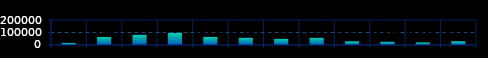
| Category | Series 0 |
|---|---|
| Mar 15 | 17227 |
| Jun 15 | 64814 |
| Sep 15 | 82965 |
| Dec 15 | 97506 |
| Mar 16 | 65379 |
| Jun 16 | 58940 |
| Sep 16 | 49947 |
| Dec 16 | 58381 |